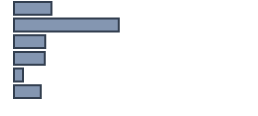
| Category | Percentatge |
|---|---|
| 0 | 15.609 |
| 1 | 43.652 |
| 2 | 13.043 |
| 3 | 12.783 |
| 4 | 3.739 |
| 5 | 11.174 |